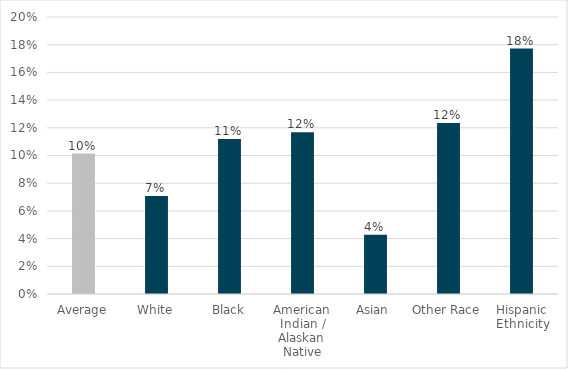
| Category | Washington |
|---|---|
| Average | 0.101 |
| White | 0.071 |
| Black | 0.112 |
| American Indian / Alaskan Native | 0.117 |
| Asian  | 0.043 |
| Other Race | 0.124 |
| Hispanic Ethnicity | 0.177 |